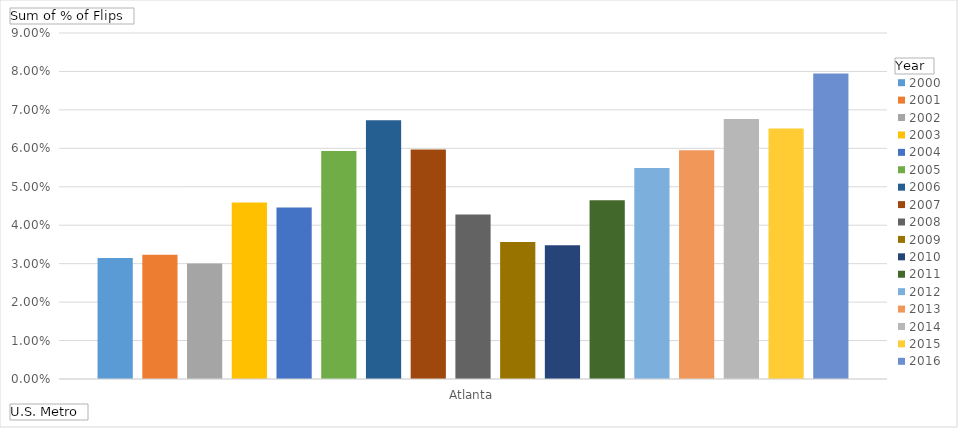
| Category | 2000 | 2001 | 2002 | 2003 | 2004 | 2005 | 2006 | 2007 | 2008 | 2009 | 2010 | 2011 | 2012 | 2013 | 2014 | 2015 | 2016 |
|---|---|---|---|---|---|---|---|---|---|---|---|---|---|---|---|---|---|
| Atlanta, GA | 0.031 | 0.032 | 0.03 | 0.046 | 0.045 | 0.059 | 0.067 | 0.06 | 0.043 | 0.036 | 0.035 | 0.046 | 0.055 | 0.06 | 0.068 | 0.065 | 0.079 |